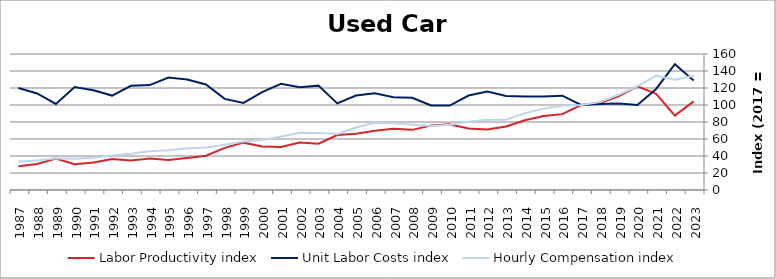
| Category | Labor Productivity index | Unit Labor Costs index | Hourly Compensation index |
|---|---|---|---|
| 2023.0 | 104.283 | 128.874 | 134.393 |
| 2022.0 | 87.588 | 148.075 | 129.695 |
| 2021.0 | 113.138 | 118.877 | 134.495 |
| 2020.0 | 121.878 | 100.122 | 122.026 |
| 2019.0 | 110.057 | 101.793 | 112.03 |
| 2018.0 | 102.329 | 101.173 | 103.529 |
| 2017.0 | 100 | 100 | 100 |
| 2016.0 | 89.254 | 110.934 | 99.013 |
| 2015.0 | 86.94 | 110.133 | 95.75 |
| 2014.0 | 82.134 | 110.054 | 90.391 |
| 2013.0 | 74.754 | 110.491 | 82.597 |
| 2012.0 | 71.268 | 115.833 | 82.551 |
| 2011.0 | 72.347 | 111.157 | 80.419 |
| 2010.0 | 77.213 | 99.311 | 76.681 |
| 2009.0 | 75.751 | 99.499 | 75.372 |
| 2008.0 | 70.746 | 108.544 | 76.791 |
| 2007.0 | 72.139 | 109.058 | 78.673 |
| 2006.0 | 69.58 | 113.841 | 79.211 |
| 2005.0 | 66.089 | 111.115 | 73.435 |
| 2004.0 | 64.742 | 101.851 | 65.94 |
| 2003.0 | 54.519 | 122.789 | 66.944 |
| 2002.0 | 55.852 | 120.808 | 67.474 |
| 2001.0 | 50.491 | 124.863 | 63.044 |
| 2000.0 | 51.171 | 115.091 | 58.894 |
| 1999.0 | 55.705 | 102.424 | 57.055 |
| 1998.0 | 49.586 | 107.184 | 53.148 |
| 1997.0 | 40.259 | 124.096 | 49.96 |
| 1996.0 | 37.764 | 129.875 | 49.046 |
| 1995.0 | 35.424 | 132.223 | 46.838 |
| 1994.0 | 36.952 | 123.428 | 45.609 |
| 1993.0 | 34.762 | 122.641 | 42.632 |
| 1992.0 | 36.451 | 111.109 | 40.5 |
| 1991.0 | 32.381 | 117.436 | 38.027 |
| 1990.0 | 30.376 | 121.176 | 36.809 |
| 1989.0 | 37.01 | 101.246 | 37.471 |
| 1988.0 | 30.666 | 113.553 | 34.822 |
| 1987.0 | 27.881 | 120.083 | 33.481 |